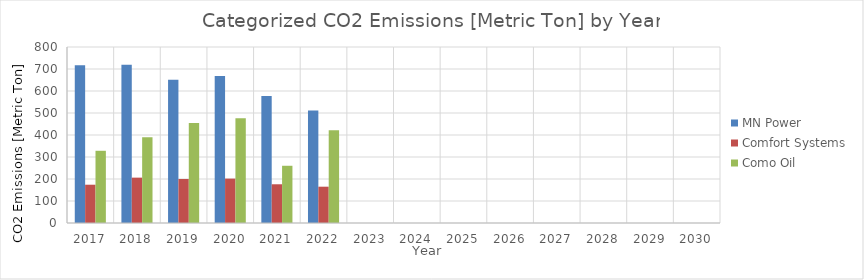
| Category | MN Power | Comfort Systems | Como Oil |
|---|---|---|---|
| 2017.0 | 716.609 | 174.026 | 328.265 |
| 2018.0 | 719.722 | 206.202 | 389.934 |
| 2019.0 | 650.907 | 200.112 | 454.63 |
| 2020.0 | 667.725 | 201.745 | 475.81 |
| 2021.0 | 577.314 | 176.039 | 260.133 |
| 2022.0 | 510.813 | 165.037 | 421.202 |
| 2023.0 | 0 | 0 | 0 |
| 2024.0 | 0 | 0 | 0 |
| 2025.0 | 0 | 0 | 0 |
| 2026.0 | 0 | 0 | 0 |
| 2027.0 | 0 | 0 | 0 |
| 2028.0 | 0 | 0 | 0 |
| 2029.0 | 0 | 0 | 0 |
| 2030.0 | 0 | 0 | 0 |